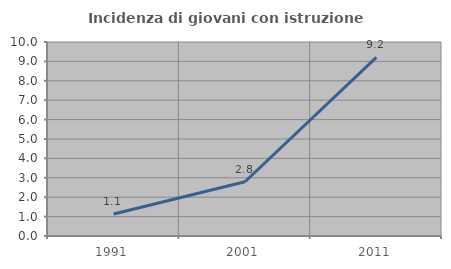
| Category | Incidenza di giovani con istruzione universitaria |
|---|---|
| 1991.0 | 1.136 |
| 2001.0 | 2.797 |
| 2011.0 | 9.211 |